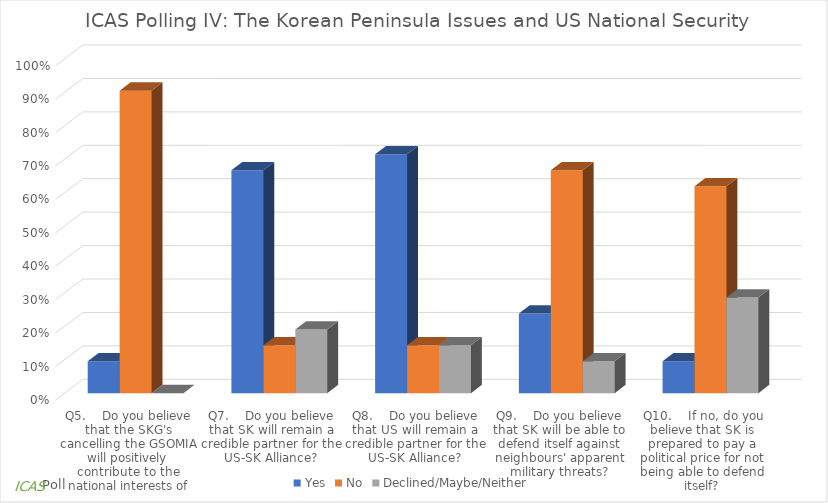
| Category | Yes | No | Declined/Maybe/Neither |
|---|---|---|---|
| Q5.    Do you believe that the SKG's cancelling the GSOMIA will positively contribute to the national interests of SK? | 0.095 | 0.905 | 0 |
| Q7.    Do you believe that SK will remain a credible partner for the US-SK Alliance? | 0.667 | 0.143 | 0.19 |
| Q8.    Do you believe that US will remain a credible partner for the US-SK Alliance? | 0.714 | 0.143 | 0.143 |
| Q9.    Do you believe that SK will be able to defend itself against neighbours' apparent military threats? | 0.238 | 0.667 | 0.095 |
| Q10.    If no, do you believe that SK is prepared to pay a political price for not being able to defend itself? | 0.095 | 0.619 | 0.286 |